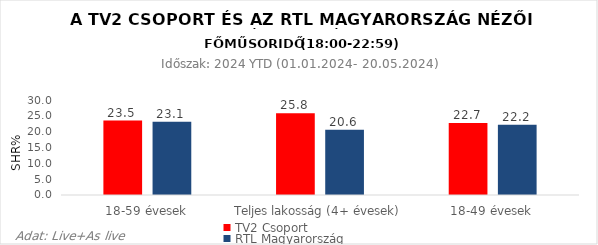
| Category | TV2 Csoport | RTL Magyarország |
|---|---|---|
| 18-59 évesek | 23.5 | 23.1 |
| Teljes lakosság (4+ évesek) | 25.8 | 20.6 |
| 18-49 évesek | 22.7 | 22.2 |